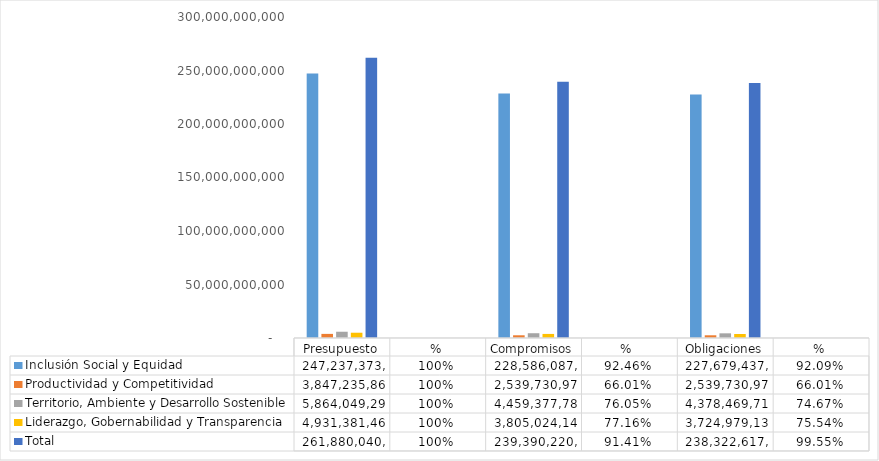
| Category | Inclusión Social y Equidad | Productividad y Competitividad | Territorio, Ambiente y Desarrollo Sostenible  | Liderazgo, Gobernabilidad y Transparencia | Total |
|---|---|---|---|---|---|
| Presupuesto | 247237373639.4 | 3847235864.82 | 5864049290.66 | 4931381465.74 | 261880040260.62 |
| % | 1 | 1 | 1 | 1 | 1 |
| Compromisos | 228586087776.033 | 2539730970 | 4459377780.85 | 3805024144.33 | 239390220671.213 |
| %  | 0.925 | 0.66 | 0.76 | 0.772 | 0.914 |
| Obligaciones | 227679437537.033 | 2539730970 | 4378469713.85 | 3724979130.33 | 238322617351.213 |
| % | 0.921 | 0.66 | 0.747 | 0.755 | 0.996 |